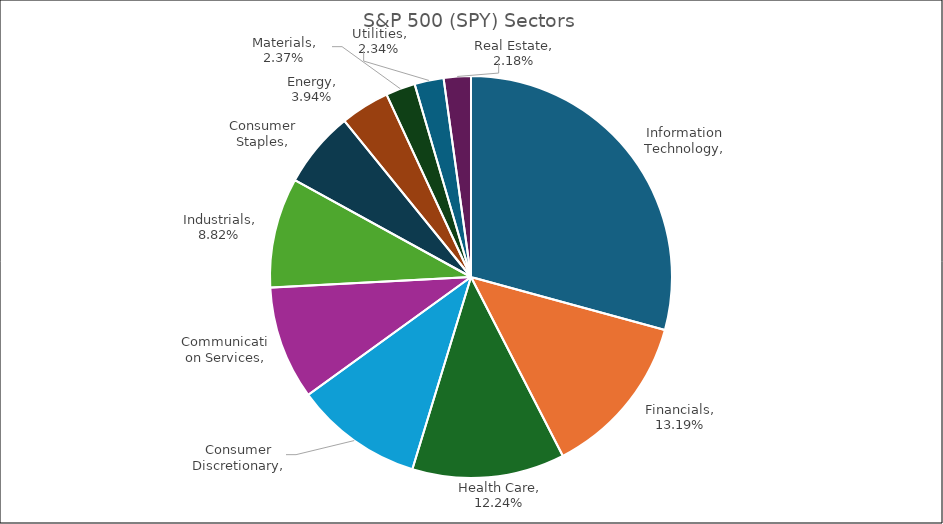
| Category | Series 0 |
|---|---|
| Information Technology, 29.20% | 0.292 |
| Financials, 13.19% | 0.132 |
| Health Care, 12.24% | 0.122 |
| Consumer Discretionary, 10.30% | 0.103 |
| Communication Services, 9.12% | 0.091 |
| Industrials, 8.82% | 0.088 |
| Consumer Staples, 6.15% | 0.062 |
| Energy, 3.94% | 0.039 |
| Materials, 2.37% | 0.024 |
| Utilities, 2.34% | 0.023 |
| Real Estate, 2.18% | 0.022 |